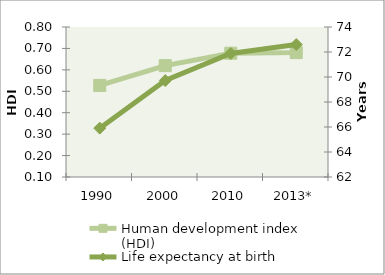
| Category | Human development index (HDI) |
|---|---|
| 1990 | 0.528 |
| 2000 | 0.62 |
| 2010 | 0.678 |
| 2013* | 0.68 |